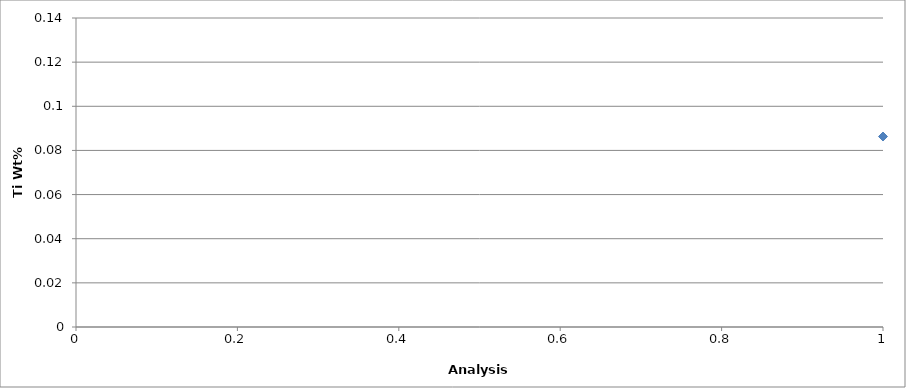
| Category | Series 0 |
|---|---|
| 0 | 0.086 |
| 1 | 0.091 |
| 2 | 0.101 |
| 3 | 0.102 |
| 4 | 0.1 |
| 5 | 0.095 |
| 6 | 0.101 |
| 7 | 0.124 |
| 8 | 0.091 |
| 9 | 0.099 |
| 10 | 0.098 |
| 11 | 0.094 |
| 12 | 0.098 |
| 13 | 0.094 |
| 14 | 0.095 |
| 15 | 0.099 |
| 16 | 0.093 |
| 17 | 0.094 |
| 18 | 0.095 |
| 19 | 0.09 |
| 20 | 0.101 |
| 21 | 0.09 |
| 22 | 0.092 |
| 23 | 0.091 |
| 24 | 0.093 |
| 25 | 0.102 |
| 26 | 0.113 |
| 27 | 0.092 |
| 28 | 0.096 |
| 29 | 0.101 |
| 30 | 0.097 |
| 31 | 0.096 |
| 32 | 0.093 |
| 33 | 0.092 |
| 34 | 0.091 |
| 35 | 0.1 |
| 36 | 0.093 |
| 37 | 0.091 |
| 38 | 0.092 |
| 39 | 0.09 |
| 40 | 0.092 |
| 41 | 0.096 |
| 42 | 0.092 |
| 43 | 0.091 |
| 44 | 0.093 |
| 45 | 0.084 |
| 46 | 0.093 |
| 47 | 0.09 |
| 48 | 0.097 |
| 49 | 0.098 |
| 50 | 0.093 |
| 51 | 0.101 |
| 52 | 0.09 |
| 53 | 0.099 |
| 54 | 0.088 |
| 55 | 0.091 |
| 56 | 0.094 |
| 57 | 0.091 |
| 58 | 0.097 |
| 59 | 0.114 |
| 60 | 0.095 |
| 61 | 0.095 |
| 62 | 0.092 |
| 63 | 0.086 |
| 64 | 0.093 |
| 65 | 0.092 |
| 66 | 0.095 |
| 67 | 0.095 |
| 68 | 0.094 |
| 69 | 0.094 |
| 70 | 0.102 |
| 71 | 0.096 |
| 72 | 0.094 |
| 73 | 0.097 |
| 74 | 0.091 |
| 75 | 0.092 |
| 76 | 0.112 |
| 77 | 0.092 |
| 78 | 0.096 |
| 79 | 0.106 |